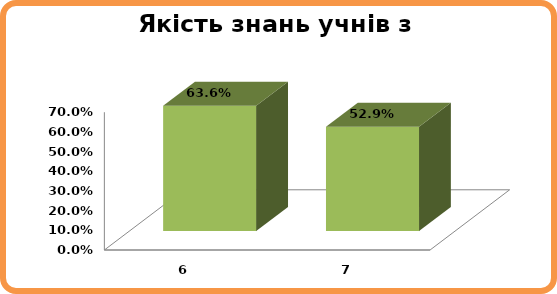
| Category | Series 0 |
|---|---|
| 6.0 | 0.636 |
| 7.0 | 0.529 |